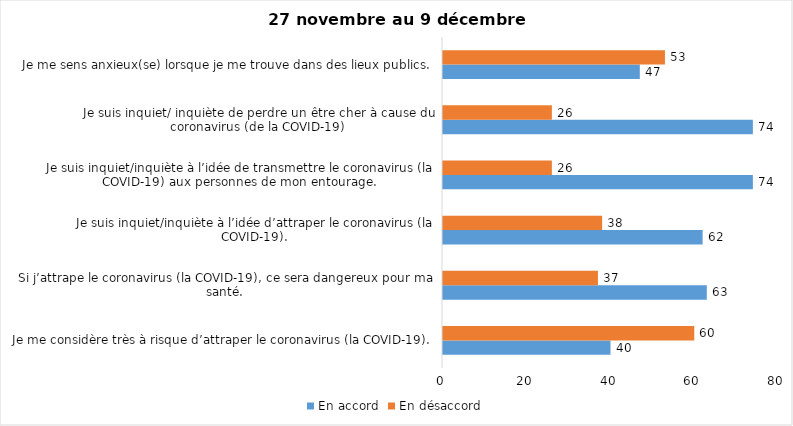
| Category | En accord | En désaccord |
|---|---|---|
| Je me considère très à risque d’attraper le coronavirus (la COVID-19). | 40 | 60 |
| Si j’attrape le coronavirus (la COVID-19), ce sera dangereux pour ma santé. | 63 | 37 |
| Je suis inquiet/inquiète à l’idée d’attraper le coronavirus (la COVID-19). | 62 | 38 |
| Je suis inquiet/inquiète à l’idée de transmettre le coronavirus (la COVID-19) aux personnes de mon entourage. | 74 | 26 |
| Je suis inquiet/ inquiète de perdre un être cher à cause du coronavirus (de la COVID-19) | 74 | 26 |
| Je me sens anxieux(se) lorsque je me trouve dans des lieux publics. | 47 | 53 |